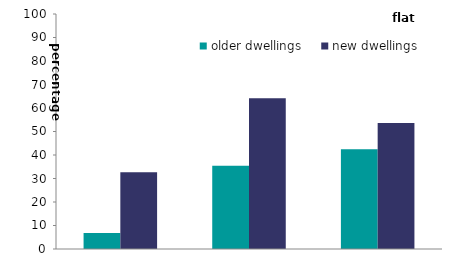
| Category | older dwellings | new dwellings |
|---|---|---|
| owner 
occupied | 6.834 | 32.652 |
| private
 rented | 35.439 | 64.103 |
| social 
sector | 42.496 | 53.622 |